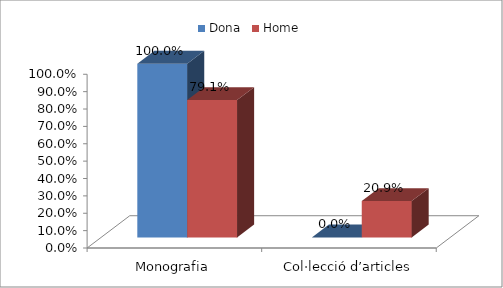
| Category | Dona | Home |
|---|---|---|
| Monografia | 1 | 0.791 |
| Col·lecció d’articles | 0 | 0.209 |